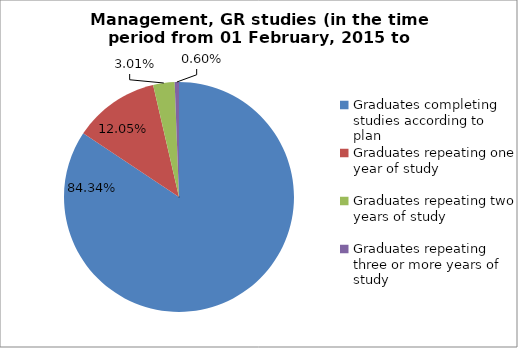
| Category | Series 0 |
|---|---|
| Graduates completing studies according to plan | 84.337 |
| Graduates repeating one year of study | 12.048 |
| Graduates repeating two years of study | 3.012 |
| Graduates repeating three or more years of study | 0.602 |